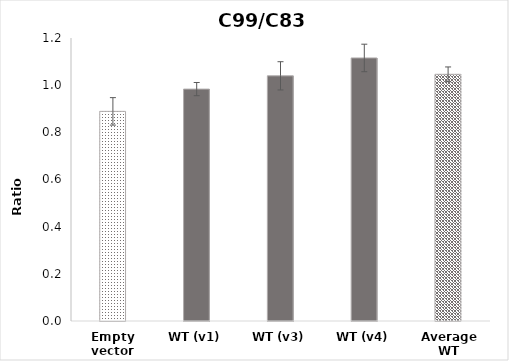
| Category | Series 0 |
|---|---|
| Empty vector | 0.889 |
| WT (v1) | 0.983 |
| WT (v3) | 1.04 |
| WT (v4) | 1.115 |
| Average WT | 1.046 |